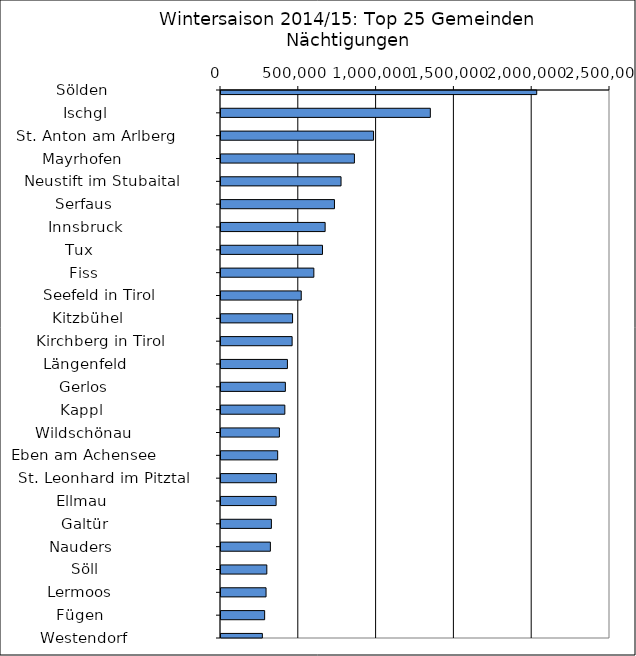
| Category | Series 0 |
|---|---|
|   Sölden                     | 2029075 |
|   Ischgl                     | 1345314 |
|   St. Anton am Arlberg       | 980455 |
|   Mayrhofen                  | 857436 |
|   Neustift im Stubaital      | 771476 |
|   Serfaus                    | 729164 |
|   Innsbruck                  | 669192 |
|   Tux                        | 652293 |
|   Fiss                       | 596701 |
|   Seefeld in Tirol           | 515687 |
|   Kitzbühel                  | 459931 |
|   Kirchberg in Tirol         | 457114 |
|   Längenfeld                 | 426911 |
|   Gerlos                     | 413671 |
|   Kappl                      | 410278 |
|   Wildschönau                | 375344 |
|   Eben am Achensee           | 364249 |
|   St. Leonhard im Pitztal    | 356424 |
|   Ellmau                     | 354199 |
|   Galtür                     | 323905 |
|   Nauders                    | 317400 |
|   Söll                       | 294475 |
|   Lermoos                    | 289589 |
|   Fügen                      | 280538 |
|   Westendorf                 | 265853 |